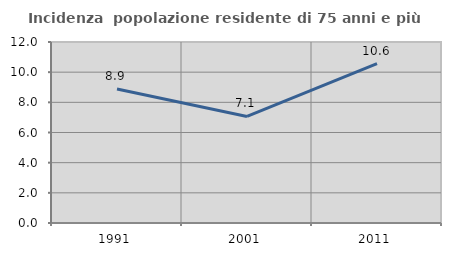
| Category | Incidenza  popolazione residente di 75 anni e più |
|---|---|
| 1991.0 | 8.889 |
| 2001.0 | 7.063 |
| 2011.0 | 10.562 |